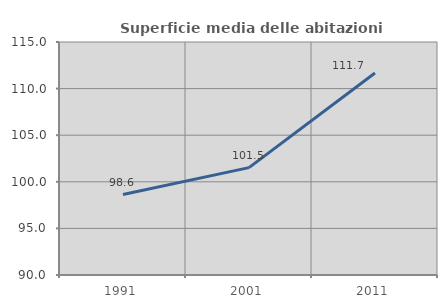
| Category | Superficie media delle abitazioni occupate |
|---|---|
| 1991.0 | 98.635 |
| 2001.0 | 101.521 |
| 2011.0 | 111.671 |